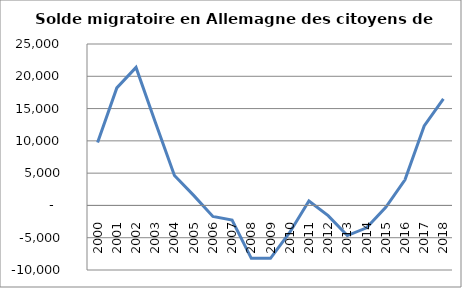
| Category | Series 0 |
|---|---|
| 2000.0 | 9763 |
| 2001.0 | 18200 |
| 2002.0 | 21378 |
| 2003.0 | 12911 |
| 2004.0 | 4639 |
| 2005.0 | 1553 |
| 2006.0 | -1704 |
| 2007.0 | -2280 |
| 2008.0 | -8190 |
| 2009.0 | -8198 |
| 2010.0 | -4190 |
| 2011.0 | 688 |
| 2012.0 | -1575 |
| 2013.0 | -4666 |
| 2014.0 | -3462 |
| 2015.0 | -287 |
| 2016.0 | 3961 |
| 2017.0 | 12305 |
| 2018.0 | 16490 |